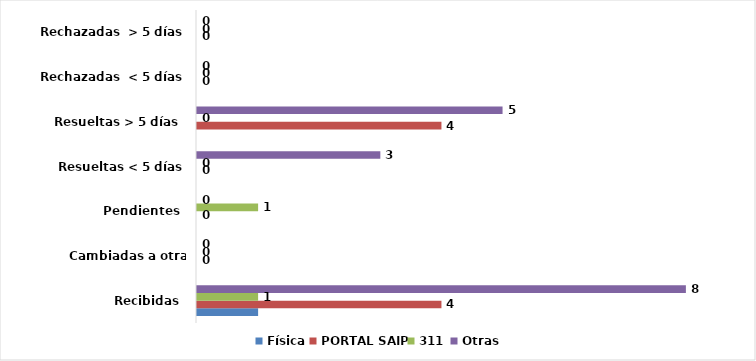
| Category | Física | PORTAL SAIP | 311 | Otras |
|---|---|---|---|---|
| Recibidas  | 1 | 4 | 1 | 8 |
| Cambiadas a otra institución | 0 | 0 | 0 | 0 |
| Pendientes  | 0 | 0 | 1 | 0 |
| Resueltas < 5 días | 0 | 0 | 0 | 3 |
| Resueltas > 5 días  | 0 | 4 | 0 | 5 |
| Rechazadas  < 5 días | 0 | 0 | 0 | 0 |
| Rechazadas  > 5 días | 0 | 0 | 0 | 0 |